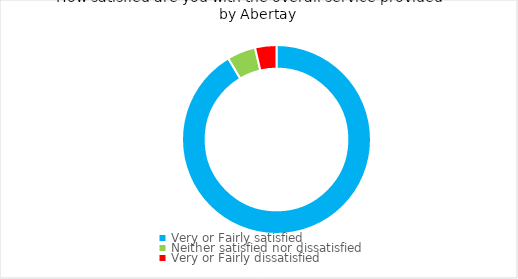
| Category | Series 0 |
|---|---|
| Very or Fairly satisfied | 91.463 |
| Neither satisfied nor dissatisfied | 4.878 |
| Very or Fairly dissatisfied | 3.659 |